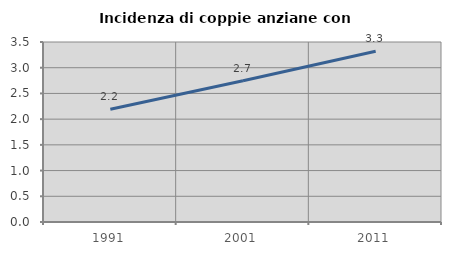
| Category | Incidenza di coppie anziane con figli |
|---|---|
| 1991.0 | 2.194 |
| 2001.0 | 2.747 |
| 2011.0 | 3.321 |